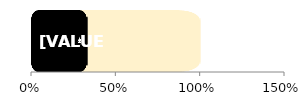
| Category | Total | Female |
|---|---|---|
| 0 | 1 | 0.33 |